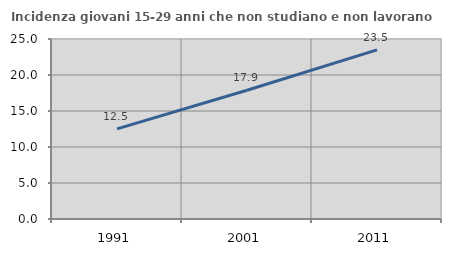
| Category | Incidenza giovani 15-29 anni che non studiano e non lavorano  |
|---|---|
| 1991.0 | 12.512 |
| 2001.0 | 17.89 |
| 2011.0 | 23.49 |